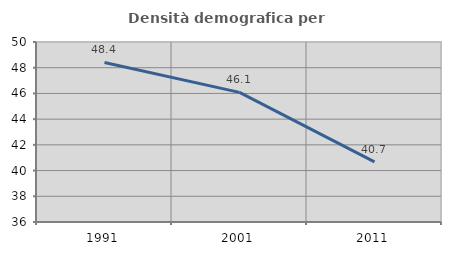
| Category | Densità demografica |
|---|---|
| 1991.0 | 48.409 |
| 2001.0 | 46.083 |
| 2011.0 | 40.68 |